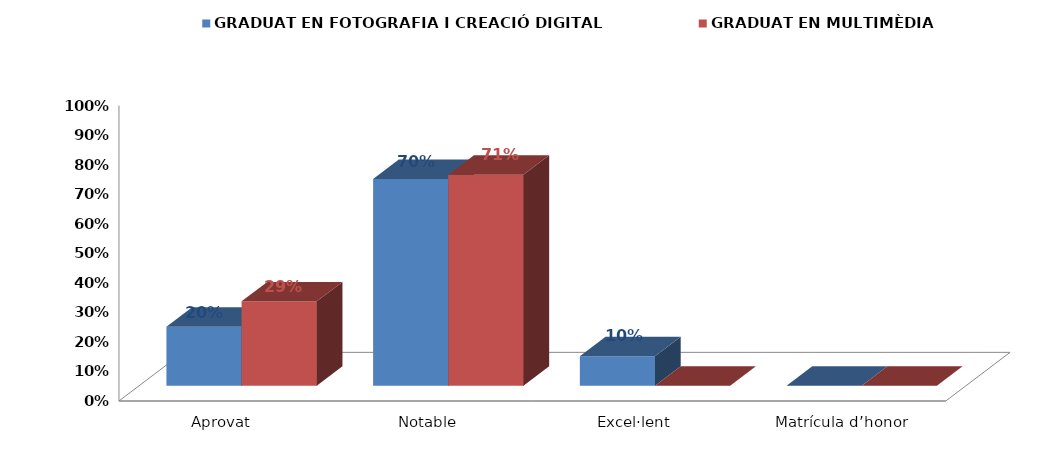
| Category | GRADUAT EN FOTOGRAFIA I CREACIÓ DIGITAL | GRADUAT EN MULTIMÈDIA |
|---|---|---|
| Aprovat | 0.2 | 0.286 |
| Notable | 0.7 | 0.714 |
| Excel·lent | 0.1 | 0 |
| Matrícula d’honor | 0 | 0 |